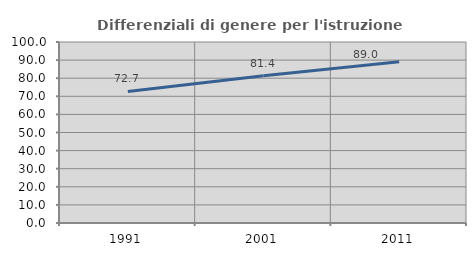
| Category | Differenziali di genere per l'istruzione superiore |
|---|---|
| 1991.0 | 72.675 |
| 2001.0 | 81.369 |
| 2011.0 | 89.026 |